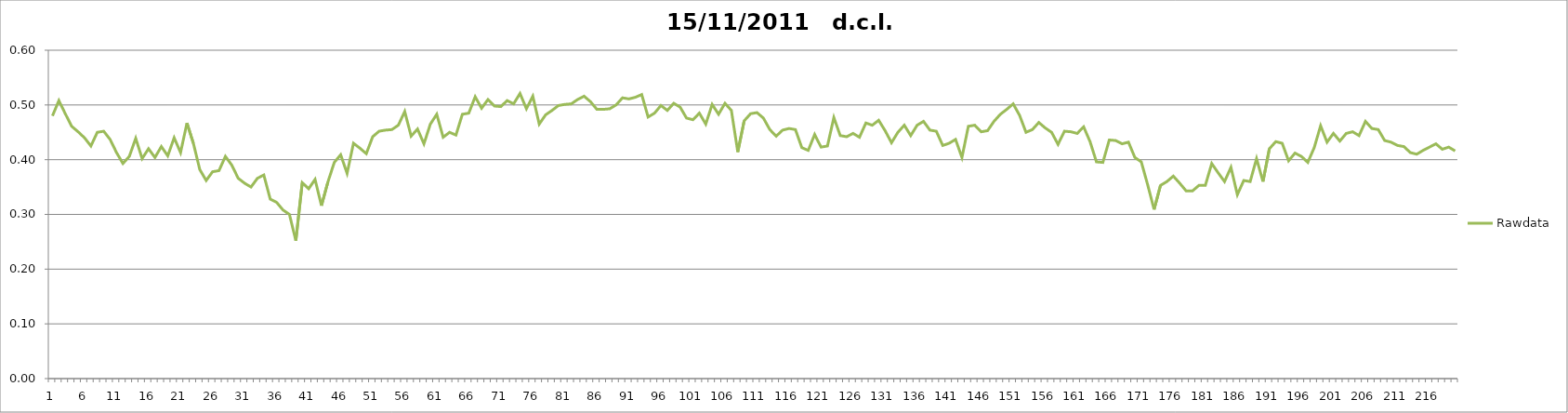
| Category | Rawdata |
|---|---|
| 0 | 0.48 |
| 1 | 0.508 |
| 2 | 0.484 |
| 3 | 0.461 |
| 4 | 0.451 |
| 5 | 0.44 |
| 6 | 0.425 |
| 7 | 0.45 |
| 8 | 0.452 |
| 9 | 0.437 |
| 10 | 0.413 |
| 11 | 0.393 |
| 12 | 0.406 |
| 13 | 0.439 |
| 14 | 0.402 |
| 15 | 0.42 |
| 16 | 0.404 |
| 17 | 0.424 |
| 18 | 0.407 |
| 19 | 0.44 |
| 20 | 0.413 |
| 21 | 0.467 |
| 22 | 0.43 |
| 23 | 0.382 |
| 24 | 0.362 |
| 25 | 0.378 |
| 26 | 0.38 |
| 27 | 0.406 |
| 28 | 0.39 |
| 29 | 0.366 |
| 30 | 0.357 |
| 31 | 0.35 |
| 32 | 0.366 |
| 33 | 0.372 |
| 34 | 0.328 |
| 35 | 0.322 |
| 36 | 0.308 |
| 37 | 0.3 |
| 38 | 0.252 |
| 39 | 0.358 |
| 40 | 0.347 |
| 41 | 0.364 |
| 42 | 0.316 |
| 43 | 0.359 |
| 44 | 0.395 |
| 45 | 0.409 |
| 46 | 0.375 |
| 47 | 0.43 |
| 48 | 0.421 |
| 49 | 0.411 |
| 50 | 0.442 |
| 51 | 0.452 |
| 52 | 0.454 |
| 53 | 0.455 |
| 54 | 0.463 |
| 55 | 0.488 |
| 56 | 0.443 |
| 57 | 0.456 |
| 58 | 0.429 |
| 59 | 0.465 |
| 60 | 0.483 |
| 61 | 0.441 |
| 62 | 0.45 |
| 63 | 0.445 |
| 64 | 0.483 |
| 65 | 0.485 |
| 66 | 0.515 |
| 67 | 0.494 |
| 68 | 0.51 |
| 69 | 0.498 |
| 70 | 0.497 |
| 71 | 0.508 |
| 72 | 0.502 |
| 73 | 0.521 |
| 74 | 0.493 |
| 75 | 0.516 |
| 76 | 0.465 |
| 77 | 0.482 |
| 78 | 0.49 |
| 79 | 0.499 |
| 80 | 0.501 |
| 81 | 0.502 |
| 82 | 0.51 |
| 83 | 0.516 |
| 84 | 0.506 |
| 85 | 0.492 |
| 86 | 0.492 |
| 87 | 0.493 |
| 88 | 0.5 |
| 89 | 0.513 |
| 90 | 0.511 |
| 91 | 0.514 |
| 92 | 0.519 |
| 93 | 0.478 |
| 94 | 0.485 |
| 95 | 0.499 |
| 96 | 0.49 |
| 97 | 0.503 |
| 98 | 0.496 |
| 99 | 0.476 |
| 100 | 0.473 |
| 101 | 0.485 |
| 102 | 0.465 |
| 103 | 0.501 |
| 104 | 0.483 |
| 105 | 0.503 |
| 106 | 0.49 |
| 107 | 0.414 |
| 108 | 0.471 |
| 109 | 0.484 |
| 110 | 0.486 |
| 111 | 0.476 |
| 112 | 0.455 |
| 113 | 0.443 |
| 114 | 0.454 |
| 115 | 0.457 |
| 116 | 0.455 |
| 117 | 0.422 |
| 118 | 0.417 |
| 119 | 0.446 |
| 120 | 0.423 |
| 121 | 0.425 |
| 122 | 0.477 |
| 123 | 0.444 |
| 124 | 0.442 |
| 125 | 0.448 |
| 126 | 0.441 |
| 127 | 0.467 |
| 128 | 0.463 |
| 129 | 0.472 |
| 130 | 0.453 |
| 131 | 0.431 |
| 132 | 0.45 |
| 133 | 0.463 |
| 134 | 0.444 |
| 135 | 0.463 |
| 136 | 0.47 |
| 137 | 0.454 |
| 138 | 0.452 |
| 139 | 0.426 |
| 140 | 0.43 |
| 141 | 0.437 |
| 142 | 0.404 |
| 143 | 0.461 |
| 144 | 0.463 |
| 145 | 0.451 |
| 146 | 0.453 |
| 147 | 0.47 |
| 148 | 0.483 |
| 149 | 0.492 |
| 150 | 0.502 |
| 151 | 0.481 |
| 152 | 0.45 |
| 153 | 0.455 |
| 154 | 0.468 |
| 155 | 0.458 |
| 156 | 0.45 |
| 157 | 0.428 |
| 158 | 0.452 |
| 159 | 0.451 |
| 160 | 0.448 |
| 161 | 0.46 |
| 162 | 0.433 |
| 163 | 0.396 |
| 164 | 0.395 |
| 165 | 0.436 |
| 166 | 0.435 |
| 167 | 0.429 |
| 168 | 0.432 |
| 169 | 0.404 |
| 170 | 0.396 |
| 171 | 0.354 |
| 172 | 0.309 |
| 173 | 0.353 |
| 174 | 0.36 |
| 175 | 0.37 |
| 176 | 0.357 |
| 177 | 0.343 |
| 178 | 0.343 |
| 179 | 0.353 |
| 180 | 0.353 |
| 181 | 0.393 |
| 182 | 0.376 |
| 183 | 0.36 |
| 184 | 0.386 |
| 185 | 0.336 |
| 186 | 0.362 |
| 187 | 0.36 |
| 188 | 0.402 |
| 189 | 0.36 |
| 190 | 0.42 |
| 191 | 0.433 |
| 192 | 0.43 |
| 193 | 0.398 |
| 194 | 0.412 |
| 195 | 0.406 |
| 196 | 0.395 |
| 197 | 0.422 |
| 198 | 0.462 |
| 199 | 0.432 |
| 200 | 0.448 |
| 201 | 0.434 |
| 202 | 0.448 |
| 203 | 0.451 |
| 204 | 0.444 |
| 205 | 0.47 |
| 206 | 0.457 |
| 207 | 0.455 |
| 208 | 0.435 |
| 209 | 0.432 |
| 210 | 0.426 |
| 211 | 0.424 |
| 212 | 0.413 |
| 213 | 0.41 |
| 214 | 0.417 |
| 215 | 0.423 |
| 216 | 0.429 |
| 217 | 0.419 |
| 218 | 0.423 |
| 219 | 0.416 |